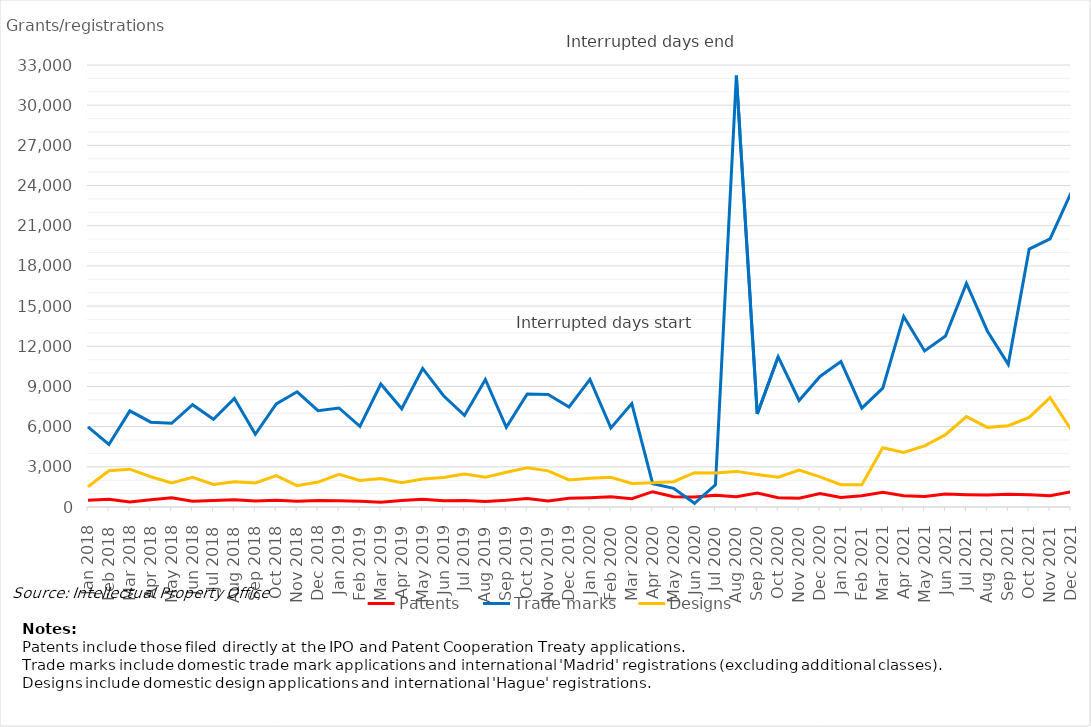
| Category | Patents | Trade marks | Designs |
|---|---|---|---|
| Jan 2018 | 495 | 5979 | 1512 |
| Feb 2018 | 574 | 4670 | 2704 |
| Mar 2018 | 370 | 7178 | 2825 |
| Apr 2018 | 543 | 6332 | 2259 |
| May 2018 | 690 | 6252 | 1789 |
| Jun 2018 | 424 | 7636 | 2222 |
| Jul 2018 | 486 | 6547 | 1678 |
| Aug 2018 | 536 | 8102 | 1878 |
| Sep 2018 | 450 | 5429 | 1795 |
| Oct 2018 | 498 | 7701 | 2348 |
| Nov 2018 | 432 | 8603 | 1592 |
| Dec 2018 | 484 | 7190 | 1859 |
| Jan 2019 | 475 | 7392 | 2444 |
| Feb 2019 | 426 | 6023 | 1987 |
| Mar 2019 | 363 | 9185 | 2125 |
| Apr 2019 | 488 | 7335 | 1810 |
| May 2019 | 573 | 10344 | 2096 |
| Jun 2019 | 471 | 8304 | 2202 |
| Jul 2019 | 489 | 6838 | 2464 |
| Aug 2019 | 420 | 9518 | 2218 |
| Sep 2019 | 500 | 5943 | 2596 |
| Oct 2019 | 634 | 8435 | 2926 |
| Nov 2019 | 455 | 8398 | 2700 |
| Dec 2019 | 654 | 7465 | 2021 |
| Jan 2020 | 696 | 9522 | 2145 |
| Feb 2020 | 756 | 5905 | 2220 |
| Mar 2020 | 622 | 7722 | 1757 |
| Apr 2020 | 1143 | 1741 | 1803 |
| May 2020 | 768 | 1397 | 1888 |
| Jun 2020 | 740 | 279 | 2564 |
| Jul 2020 | 878 | 1658 | 2539 |
| Aug 2020 | 771 | 32205 | 2659 |
| Sep 2020 | 1042 | 6944 | 2425 |
| Oct 2020 | 697 | 11215 | 2223 |
| Nov 2020 | 649 | 7953 | 2763 |
| Dec 2020 | 1010 | 9745 | 2252 |
| Jan 2021 | 708 | 10856 | 1665 |
| Feb 2021 | 838 | 7380 | 1660 |
| Mar 2021 | 1107 | 8877 | 4427 |
| Apr 2021 | 838 | 14233 | 4076 |
| May 2021 | 788 | 11654 | 4564 |
| Jun 2021 | 972 | 12772 | 5401 |
| Jul 2021 | 918 | 16692 | 6746 |
| Aug 2021 | 887 | 13144 | 5946 |
| Sep 2021 | 947 | 10649 | 6073 |
| Oct 2021 | 920 | 19256 | 6691 |
| Nov 2021 | 841 | 20024 | 8170 |
| Dec 2021 | 1131 | 23456 | 5790 |